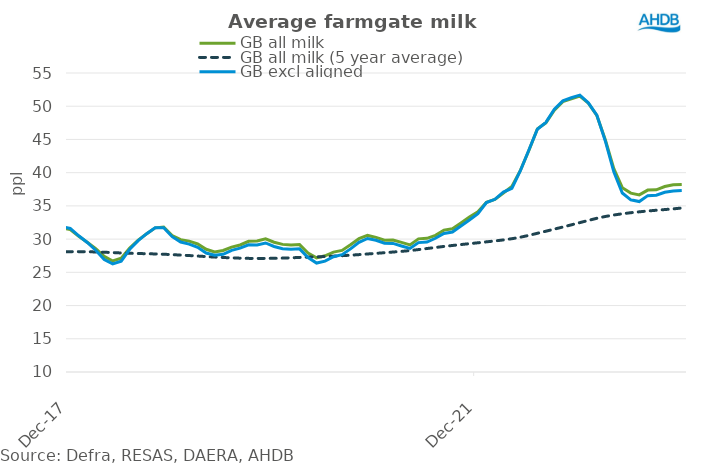
| Category | GB all milk | GB all milk (5 year average) | GB excl aligned |
|---|---|---|---|
| 2010-04-01 | 23.396 | 22.051 | 22.994 |
| 2010-05-01 | 23.39 | 22.152 | 23.011 |
| 2010-06-01 | 23.603 | 22.254 | 23.189 |
| 2010-07-01 | 24.227 | 22.353 | 23.855 |
| 2010-08-01 | 24.736 | 22.454 | 24.398 |
| 2010-09-01 | 25.272 | 22.551 | 24.921 |
| 2010-10-01 | 25.779 | 22.652 | 25.391 |
| 2010-11-01 | 25.935 | 22.755 | 25.538 |
| 2010-12-01 | 25.907 | 22.866 | 25.46 |
| 2011-01-01 | 25.732 | 22.983 | 25.231 |
| 2011-02-01 | 25.868 | 23.106 | 25.384 |
| 2011-03-01 | 26.324 | 23.239 | 25.883 |
| 2011-04-01 | 26.5 | 23.387 | 26.121 |
| 2011-05-01 | 26.503 | 23.545 | 26.137 |
| 2011-06-01 | 26.712 | 23.705 | 26.333 |
| 2011-07-01 | 27.27 | 23.868 | 26.911 |
| 2011-08-01 | 27.526 | 24.03 | 27.106 |
| 2011-09-01 | 28.07 | 24.188 | 27.683 |
| 2011-10-01 | 29.167 | 24.358 | 28.784 |
| 2011-11-01 | 29.551 | 24.532 | 29.216 |
| 2011-12-01 | 29.441 | 24.712 | 29.134 |
| 2012-01-01 | 29.16 | 24.896 | 28.845 |
| 2012-02-01 | 29.17 | 25.083 | 28.826 |
| 2012-03-01 | 28.975 | 25.269 | 28.627 |
| 2012-04-01 | 28.362 | 25.447 | 28.085 |
| 2012-05-01 | 27.904 | 25.621 | 27.598 |
| 2012-06-01 | 26.906 | 25.772 | 26.398 |
| 2012-07-01 | 27.033 | 25.901 | 26.461 |
| 2012-08-01 | 27.01 | 26.016 | 26.428 |
| 2012-09-01 | 27.739 | 26.105 | 27.154 |
| 2012-10-01 | 29.17 | 26.158 | 28.627 |
| 2012-11-01 | 29.857 | 26.207 | 29.453 |
| 2012-12-01 | 30.165 | 26.27 | 29.875 |
| 2013-01-01 | 30.265 | 26.345 | 29.828 |
| 2013-02-01 | 30.434 | 26.422 | 29.991 |
| 2013-03-01 | 30.422 | 26.495 | 29.991 |
| 2013-04-01 | 30.05 | 26.572 | 29.654 |
| 2013-05-01 | 29.842 | 26.652 | 29.474 |
| 2013-06-01 | 30.642 | 26.737 | 30.38 |
| 2013-07-01 | 31.426 | 26.821 | 31.122 |
| 2013-08-01 | 31.866 | 26.907 | 31.473 |
| 2013-09-01 | 32.827 | 26.997 | 32.539 |
| 2013-10-01 | 33.528 | 27.091 | 33.229 |
| 2013-11-01 | 34.494 | 27.199 | 34.342 |
| 2013-12-01 | 34.2 | 27.31 | 34.205 |
| 2014-01-01 | 33.867 | 27.427 | 33.805 |
| 2014-02-01 | 33.993 | 27.564 | 33.942 |
| 2014-03-01 | 33.707 | 27.701 | 33.718 |
| 2014-04-01 | 33.36 | 27.854 | 33.337 |
| 2014-05-01 | 32.543 | 28.045 | 32.516 |
| 2014-06-01 | 32.109 | 28.193 | 31.953 |
| 2014-07-01 | 32.151 | 28.33 | 31.805 |
| 2014-08-01 | 31.795 | 28.46 | 31.35 |
| 2014-09-01 | 31.501 | 28.575 | 30.967 |
| 2014-10-01 | 30.487 | 28.672 | 29.83 |
| 2014-11-01 | 29.66 | 28.754 | 29.115 |
| 2014-12-01 | 28.556 | 28.82 | 27.961 |
| 2015-01-01 | 27.203 | 28.865 | 26.316 |
| 2015-02-01 | 26.682 | 28.903 | 25.672 |
| 2015-03-01 | 25.51 | 28.925 | 24.417 |
| 2015-04-01 | 25.209 | 28.955 | 24.186 |
| 2015-05-01 | 24.778 | 28.978 | 23.868 |
| 2015-06-01 | 24.575 | 28.994 | 23.481 |
| 2015-07-01 | 24.53 | 28.999 | 23.305 |
| 2015-08-01 | 24.234 | 28.991 | 22.855 |
| 2015-09-01 | 24.529 | 28.979 | 23.184 |
| 2015-10-01 | 25.108 | 28.967 | 23.795 |
| 2015-11-01 | 24.696 | 28.947 | 23.448 |
| 2015-12-01 | 24.682 | 28.926 | 23.513 |
| 2016-01-01 | 24.002 | 28.897 | 22.712 |
| 2016-02-01 | 23.859 | 28.864 | 22.542 |
| 2016-03-01 | 23.244 | 28.813 | 21.853 |
| 2016-04-01 | 22.31 | 28.743 | 20.652 |
| 2016-05-01 | 20.982 | 28.651 | 19.436 |
| 2016-06-01 | 20.489 | 28.547 | 18.856 |
| 2016-07-01 | 21.235 | 28.446 | 19.691 |
| 2016-08-01 | 21.738 | 28.35 | 20.334 |
| 2016-09-01 | 22.941 | 28.264 | 21.722 |
| 2016-10-01 | 24.144 | 28.181 | 23.227 |
| 2016-11-01 | 25.371 | 28.111 | 24.679 |
| 2016-12-01 | 26.061 | 28.055 | 25.6 |
| 2017-01-01 | 27.097 | 28.02 | 26.901 |
| 2017-02-01 | 27.737 | 27.997 | 27.614 |
| 2017-03-01 | 27.694 | 27.975 | 27.563 |
| 2017-04-01 | 27.084 | 27.954 | 26.845 |
| 2017-05-01 | 26.835 | 27.936 | 26.461 |
| 2017-06-01 | 26.681 | 27.932 | 26.258 |
| 2017-07-01 | 27.782 | 27.945 | 27.45 |
| 2017-08-01 | 28.862 | 27.976 | 28.635 |
| 2017-09-01 | 30.311 | 28.019 | 30.258 |
| 2017-10-01 | 31.638 | 28.06 | 31.793 |
| 2017-11-01 | 31.712 | 28.091 | 31.907 |
| 2017-12-01 | 31.427 | 28.112 | 31.602 |
| 2018-01-01 | 30.431 | 28.114 | 30.501 |
| 2018-02-01 | 29.524 | 28.099 | 29.498 |
| 2018-03-01 | 28.564 | 28.068 | 28.331 |
| 2018-04-01 | 27.392 | 28.024 | 26.927 |
| 2018-05-01 | 26.712 | 27.972 | 26.266 |
| 2018-06-01 | 27.115 | 27.913 | 26.678 |
| 2018-07-01 | 28.641 | 27.867 | 28.469 |
| 2018-08-01 | 29.857 | 27.833 | 29.772 |
| 2018-09-01 | 30.804 | 27.799 | 30.821 |
| 2018-10-01 | 31.69 | 27.769 | 31.703 |
| 2018-11-01 | 31.821 | 27.724 | 31.71 |
| 2018-12-01 | 30.542 | 27.663 | 30.367 |
| 2019-01-01 | 29.915 | 27.597 | 29.554 |
| 2019-02-01 | 29.696 | 27.526 | 29.245 |
| 2019-03-01 | 29.266 | 27.452 | 28.774 |
| 2019-04-01 | 28.466 | 27.37 | 27.907 |
| 2019-05-01 | 28.077 | 27.296 | 27.57 |
| 2019-06-01 | 28.291 | 27.232 | 27.717 |
| 2019-07-01 | 28.799 | 27.176 | 28.311 |
| 2019-08-01 | 29.117 | 27.132 | 28.637 |
| 2019-09-01 | 29.663 | 27.101 | 29.142 |
| 2019-10-01 | 29.712 | 27.088 | 29.127 |
| 2019-11-01 | 30.037 | 27.094 | 29.417 |
| 2019-12-01 | 29.526 | 27.11 | 28.891 |
| 2020-01-01 | 29.206 | 27.144 | 28.562 |
| 2020-02-01 | 29.122 | 27.185 | 28.477 |
| 2020-03-01 | 29.171 | 27.246 | 28.532 |
| 2020-04-01 | 27.906 | 27.291 | 27.235 |
| 2020-05-01 | 27.178 | 27.331 | 26.394 |
| 2020-06-01 | 27.492 | 27.379 | 26.688 |
| 2020-07-01 | 28.042 | 27.438 | 27.34 |
| 2020-08-01 | 28.304 | 27.506 | 27.666 |
| 2020-09-01 | 29.157 | 27.583 | 28.527 |
| 2020-10-01 | 30.064 | 27.665 | 29.503 |
| 2020-11-01 | 30.554 | 27.763 | 30.095 |
| 2020-12-01 | 30.267 | 27.856 | 29.826 |
| 2021-01-01 | 29.845 | 27.953 | 29.38 |
| 2021-02-01 | 29.876 | 28.054 | 29.355 |
| 2021-03-01 | 29.511 | 28.158 | 28.966 |
| 2021-04-01 | 29.136 | 28.272 | 28.592 |
| 2021-05-01 | 30.036 | 28.423 | 29.471 |
| 2021-06-01 | 30.116 | 28.583 | 29.562 |
| 2021-07-01 | 30.569 | 28.739 | 30.128 |
| 2021-08-01 | 31.352 | 28.899 | 30.852 |
| 2021-09-01 | 31.565 | 29.043 | 31.076 |
| 2021-10-01 | 32.43 | 29.181 | 31.987 |
| 2021-11-01 | 33.315 | 29.313 | 32.876 |
| 2021-12-01 | 34.109 | 29.447 | 33.822 |
| 2022-01-01 | 35.526 | 29.588 | 35.507 |
| 2022-02-01 | 35.967 | 29.725 | 35.995 |
| 2022-03-01 | 36.946 | 29.879 | 37.09 |
| 2022-04-01 | 37.935 | 30.06 | 37.658 |
| 2022-05-01 | 40.348 | 30.285 | 40.294 |
| 2022-06-01 | 43.339 | 30.563 | 43.409 |
| 2022-07-01 | 46.595 | 30.876 | 46.534 |
| 2022-08-01 | 47.501 | 31.187 | 47.566 |
| 2022-09-01 | 49.397 | 31.505 | 49.541 |
| 2022-10-01 | 50.687 | 31.823 | 50.807 |
| 2022-11-01 | 51.115 | 32.146 | 51.276 |
| 2022-12-01 | 51.536 | 32.481 | 51.678 |
| 2023-01-01 | 50.462 | 32.815 | 50.51 |
| 2023-02-01 | 48.612 | 33.133 | 48.663 |
| 2023-03-01 | 44.96 | 33.406 | 44.774 |
| 2023-04-01 | 40.6 | 33.627 | 40.127 |
| 2023-05-01 | 37.746 | 33.811 | 36.938 |
| 2023-06-01 | 36.921 | 33.974 | 35.911 |
| 2023-07-01 | 36.659 | 34.108 | 35.65 |
| 2023-08-01 | 37.377 | 34.233 | 36.544 |
| 2023-09-01 | 37.424 | 34.343 | 36.617 |
| 2023-10-01 | 37.913 | 34.447 | 37.048 |
| 2023-11-01 | 38.179 | 34.553 | 37.244 |
| 2023-12-01 | 38.224 | 34.681 | 37.307 |